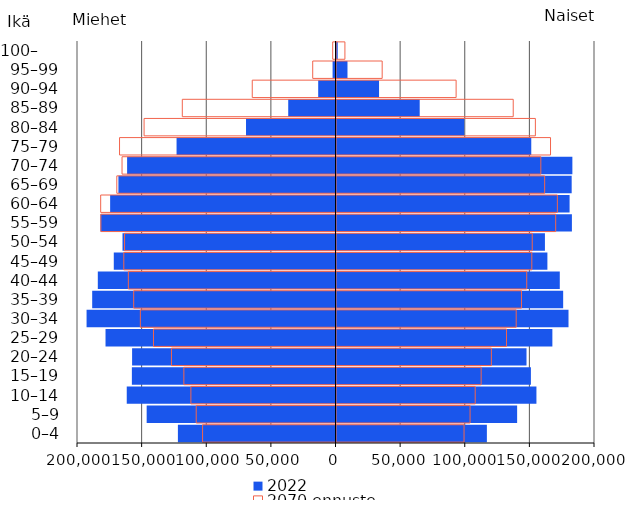
| Category | 2022 | 2070 ennuste |
|---|---|---|
| 0–4 | 116348 | 98675 |
| 5–9 | 139754 | 103340 |
| 10–14 | 154687 | 107315 |
| 15–19 | 150416 | 111910 |
| 20–24 | 147012 | 119832 |
| 25–29 | 167020 | 131518 |
| 30–34 | 179506 | 139035 |
| 35–39 | 175371 | 143112 |
| 40–44 | 172759 | 147183 |
| 45–49 | 163165 | 151106 |
| 50–54 | 161264 | 151443 |
| 55–59 | 182134 | 169578 |
| 60–64 | 180339 | 170887 |
| 65–69 | 181956 | 161040 |
| 70–74 | 182494 | 158084 |
| 75–79 | 150690 | 165589 |
| 80–84 | 98839 | 153874 |
| 85–89 | 64374 | 136731 |
| 90–94 | 32918 | 92552 |
| 95–99 | 8498 | 35341 |
| 100–     | 949 | 6515 |